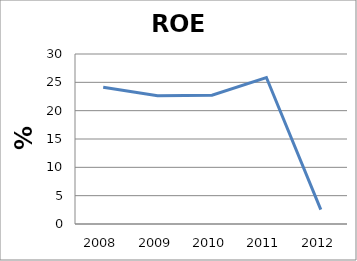
| Category | Series 0 |
|---|---|
| 2008.0 | 24.15 |
| 2009.0 | 22.62 |
| 2010.0 | 22.72 |
| 2011.0 | 25.85 |
| 2012.0 | 2.53 |